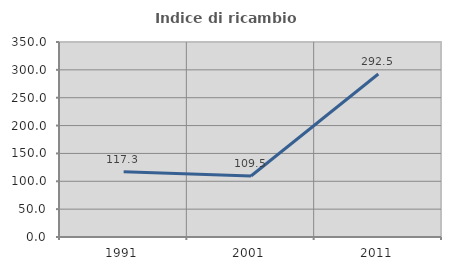
| Category | Indice di ricambio occupazionale  |
|---|---|
| 1991.0 | 117.337 |
| 2001.0 | 109.474 |
| 2011.0 | 292.523 |